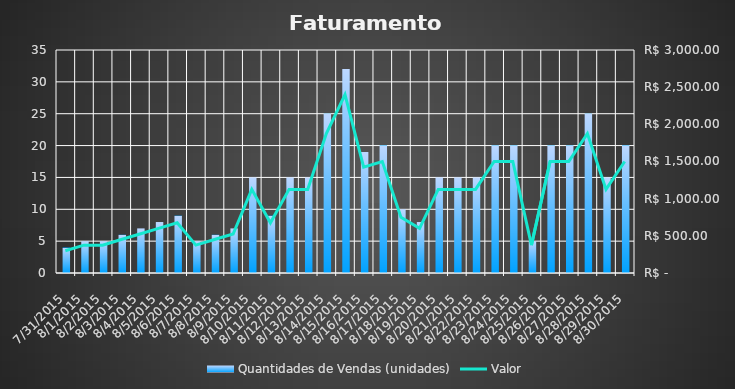
| Category | Quantidades de Vendas (unidades) |
|---|---|
| 7/31/15 | 4 |
| 8/1/15 | 5 |
| 8/2/15 | 5 |
| 8/3/15 | 6 |
| 8/4/15 | 7 |
| 8/5/15 | 8 |
| 8/6/15 | 9 |
| 8/7/15 | 5 |
| 8/8/15 | 6 |
| 8/9/15 | 7 |
| 8/10/15 | 15 |
| 8/11/15 | 9 |
| 8/12/15 | 15 |
| 8/13/15 | 15 |
| 8/14/15 | 25 |
| 8/15/15 | 32 |
| 8/16/15 | 19 |
| 8/17/15 | 20 |
| 8/18/15 | 10 |
| 8/19/15 | 8 |
| 8/20/15 | 15 |
| 8/21/15 | 15 |
| 8/22/15 | 15 |
| 8/23/15 | 20 |
| 8/24/15 | 20 |
| 8/25/15 | 5 |
| 8/26/15 | 20 |
| 8/27/15 | 20 |
| 8/28/15 | 25 |
| 8/29/15 | 15 |
| 8/30/15 | 20 |